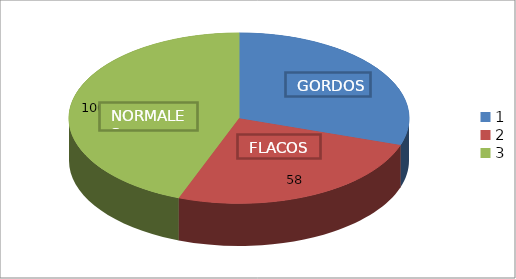
| Category | Series 0 | GORDO  FLACOS NORMALES  |
|---|---|---|
| 0 | 68 |  |
| 1 | 58 |  |
| 2 | 100 |  |